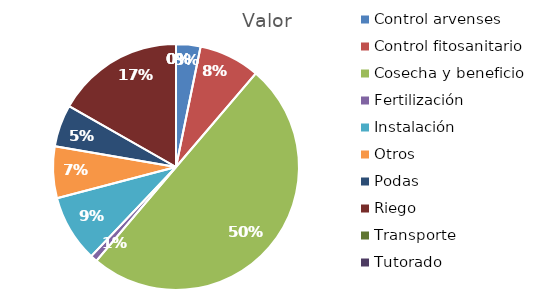
| Category | Valor |
|---|---|
| Control arvenses | 891450 |
| Control fitosanitario | 2228625 |
| Cosecha y beneficio | 13867000 |
| Fertilización | 247625 |
| Instalación | 2449739 |
| Otros | 1881950 |
| Podas | 1535275 |
| Riego | 4655350 |
| Transporte | 0 |
| Tutorado | 0 |